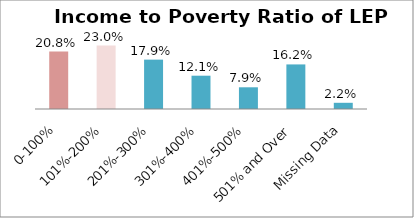
| Category | Percent |
|---|---|
| 0-100% | 0.208 |
| 101%-200% | 0.23 |
| 201%-300% | 0.179 |
| 301%-400% | 0.121 |
| 401%-500% | 0.079 |
| 501% and Over | 0.162 |
| Missing Data | 0.022 |